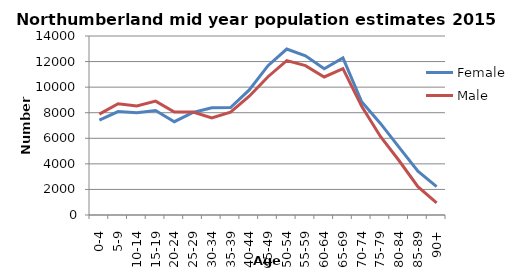
| Category | Female | Male |
|---|---|---|
| 0-4 | 7422 | 7894 |
| 5-9 | 8090 | 8706 |
| 10-14 | 8000 | 8530 |
| 15-19 | 8172 | 8905 |
| 20-24 | 7297 | 8050 |
| 25-29 | 8017 | 8051 |
| 30-34 | 8388 | 7597 |
| 35-39 | 8402 | 8039 |
| 40-44 | 9780 | 9288 |
| 45-49 | 11678 | 10815 |
| 50-54 | 12979 | 12081 |
| 55-59 | 12454 | 11680 |
| 60-64 | 11431 | 10796 |
| 65-69 | 12283 | 11447 |
| 70-74 | 8857 | 8499 |
| 75-79 | 7161 | 6141 |
| 80-84 | 5293 | 4243 |
| 85-89 | 3427 | 2210 |
| 90+ | 2218 | 942 |